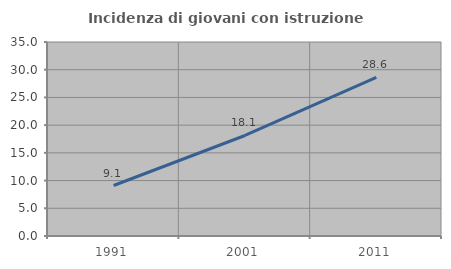
| Category | Incidenza di giovani con istruzione universitaria |
|---|---|
| 1991.0 | 9.108 |
| 2001.0 | 18.134 |
| 2011.0 | 28.636 |